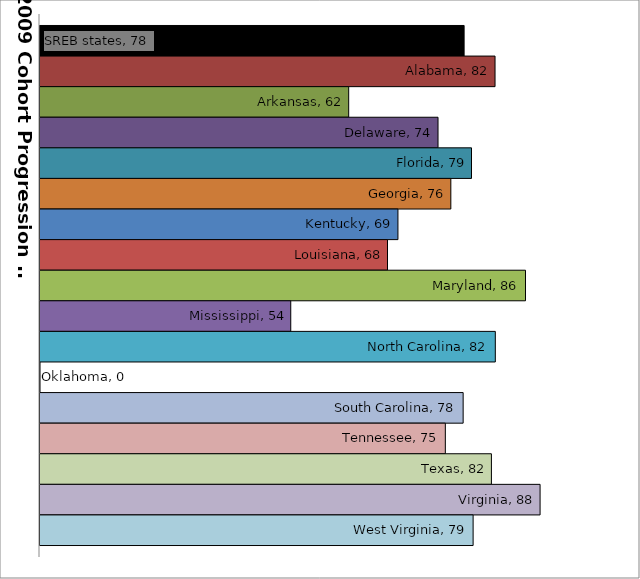
| Category | SREB states | Alabama | Arkansas | Delaware | Florida | Georgia | Kentucky | Louisiana | Maryland | Mississippi | North Carolina | Oklahoma | South Carolina | Tennessee | Texas | Virginia | West Virginia |
|---|---|---|---|---|---|---|---|---|---|---|---|---|---|---|---|---|---|
| 0 | 77.999 | 82.228 | 62.214 | 74.431 | 79.01 | 76.183 | 68.949 | 67.522 | 86.393 | 54.291 | 82.265 | 0 | 77.867 | 75.43 | 81.732 | 88.387 | 79.229 |